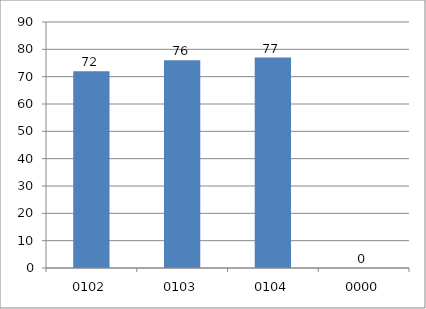
| Category | Series 0 |
|---|---|
| 102.0 | 72 |
| 103.0 | 76 |
| 104.0 | 77 |
| 0.0 | 0 |